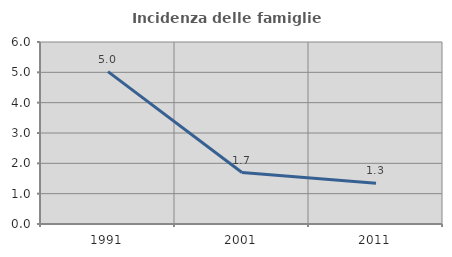
| Category | Incidenza delle famiglie numerose |
|---|---|
| 1991.0 | 5.022 |
| 2001.0 | 1.696 |
| 2011.0 | 1.346 |